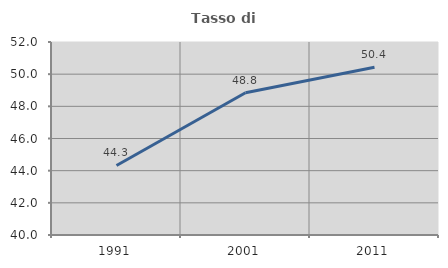
| Category | Tasso di occupazione   |
|---|---|
| 1991.0 | 44.325 |
| 2001.0 | 48.847 |
| 2011.0 | 50.434 |